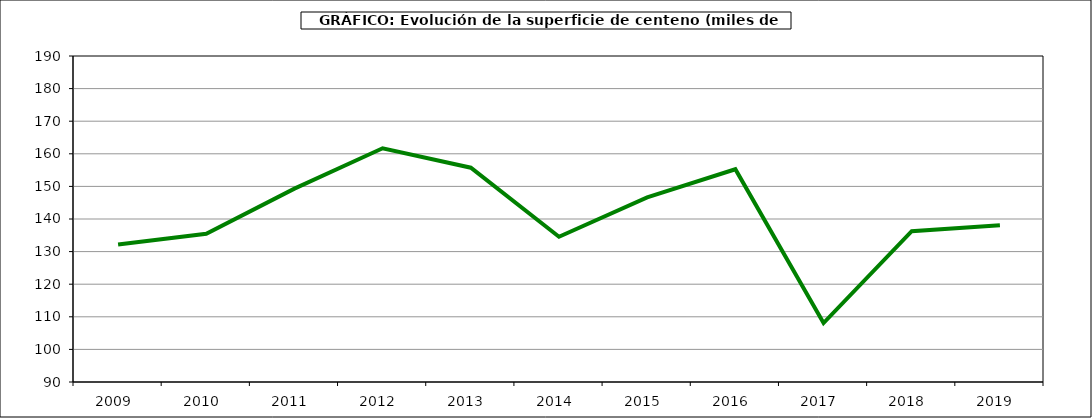
| Category | Superficie |
|---|---|
| 2009.0 | 132.161 |
| 2010.0 | 135.488 |
| 2011.0 | 149.321 |
| 2012.0 | 161.702 |
| 2013.0 | 155.734 |
| 2014.0 | 134.563 |
| 2015.0 | 146.625 |
| 2016.0 | 155.256 |
| 2017.0 | 108.08 |
| 2018.0 | 136.251 |
| 2019.0 | 138.093 |